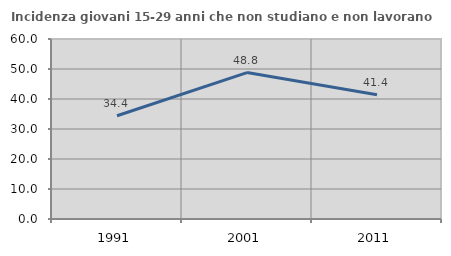
| Category | Incidenza giovani 15-29 anni che non studiano e non lavorano  |
|---|---|
| 1991.0 | 34.426 |
| 2001.0 | 48.809 |
| 2011.0 | 41.387 |